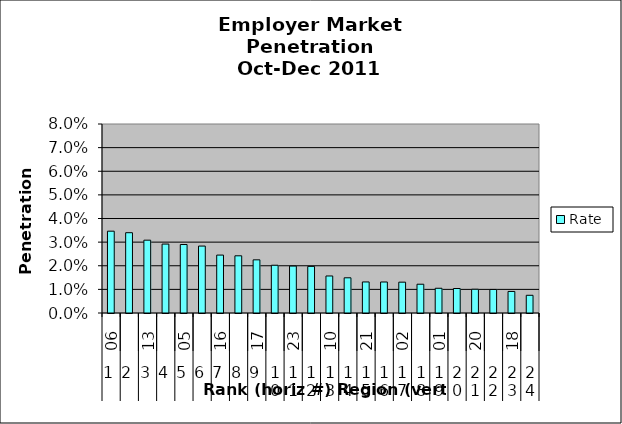
| Category | Rate |
|---|---|
| 0 | 0.035 |
| 1 | 0.034 |
| 2 | 0.031 |
| 3 | 0.029 |
| 4 | 0.029 |
| 5 | 0.028 |
| 6 | 0.025 |
| 7 | 0.024 |
| 8 | 0.023 |
| 9 | 0.02 |
| 10 | 0.02 |
| 11 | 0.02 |
| 12 | 0.016 |
| 13 | 0.015 |
| 14 | 0.013 |
| 15 | 0.013 |
| 16 | 0.013 |
| 17 | 0.012 |
| 18 | 0.01 |
| 19 | 0.01 |
| 20 | 0.01 |
| 21 | 0.01 |
| 22 | 0.009 |
| 23 | 0.007 |